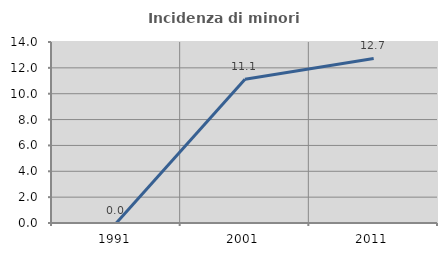
| Category | Incidenza di minori stranieri |
|---|---|
| 1991.0 | 0 |
| 2001.0 | 11.111 |
| 2011.0 | 12.727 |